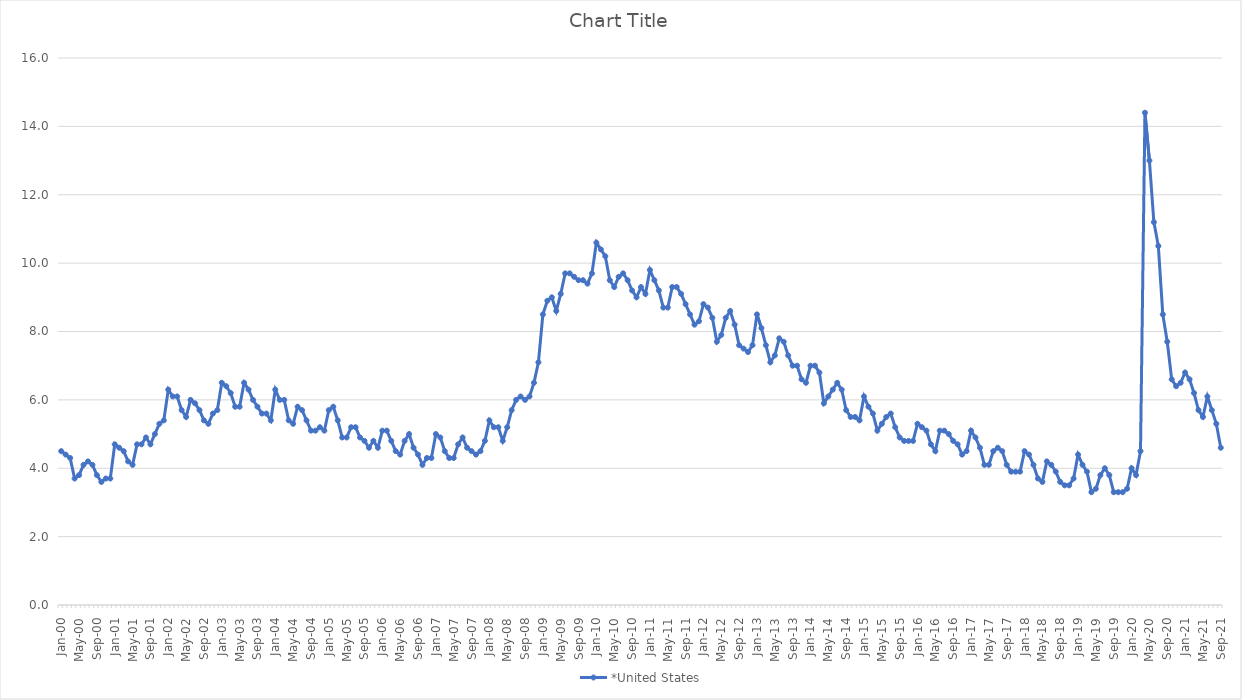
| Category | *United States | Alaska | Alabama | Arkansas | Arizona | California | Colorado | Connecticut | Delaware | Florida | Georgia | Hawaii | Iowa | Idaho | Illinois | Indiana | Kansas | Kentucky | Louisiana | Massachusetts | Maryland | Maine | Michigan | Minnesota | Missouri | Mississippi | Montana | North Carolina | North Dakota | Nebraska | New Hampshire | New Jersey | New Mexico | Nevada | New York | Ohio | Oklahoma | Oregon | Pennsylvania | Rhode Island | South Carolina | South Dakota | Tennessee | Texas | Utah | Virginia | Vermont | Washington | Wisconsin | West Virginia | Wyoming |
|---|---|---|---|---|---|---|---|---|---|---|---|---|---|---|---|---|---|---|---|---|---|---|---|---|---|---|---|---|---|---|---|---|---|---|---|---|---|---|---|---|---|---|---|---|---|---|---|---|---|---|---|
| Jan-00 | 4.5 |  |  |  |  |  |  |  |  |  |  |  |  |  |  |  |  |  |  |  |  |  |  |  |  |  |  |  |  |  |  |  |  |  |  |  |  |  |  |  |  |  |  |  |  |  |  |  |  |  |  |
| Feb-00 | 4.4 |  |  |  |  |  |  |  |  |  |  |  |  |  |  |  |  |  |  |  |  |  |  |  |  |  |  |  |  |  |  |  |  |  |  |  |  |  |  |  |  |  |  |  |  |  |  |  |  |  |  |
| Mar-00 | 4.3 |  |  |  |  |  |  |  |  |  |  |  |  |  |  |  |  |  |  |  |  |  |  |  |  |  |  |  |  |  |  |  |  |  |  |  |  |  |  |  |  |  |  |  |  |  |  |  |  |  |  |
| Apr-00 | 3.7 |  |  |  |  |  |  |  |  |  |  |  |  |  |  |  |  |  |  |  |  |  |  |  |  |  |  |  |  |  |  |  |  |  |  |  |  |  |  |  |  |  |  |  |  |  |  |  |  |  |  |
| May-00 | 3.8 |  |  |  |  |  |  |  |  |  |  |  |  |  |  |  |  |  |  |  |  |  |  |  |  |  |  |  |  |  |  |  |  |  |  |  |  |  |  |  |  |  |  |  |  |  |  |  |  |  |  |
| Jun-00 | 4.1 |  |  |  |  |  |  |  |  |  |  |  |  |  |  |  |  |  |  |  |  |  |  |  |  |  |  |  |  |  |  |  |  |  |  |  |  |  |  |  |  |  |  |  |  |  |  |  |  |  |  |
| Jul-00 | 4.2 |  |  |  |  |  |  |  |  |  |  |  |  |  |  |  |  |  |  |  |  |  |  |  |  |  |  |  |  |  |  |  |  |  |  |  |  |  |  |  |  |  |  |  |  |  |  |  |  |  |  |
| Aug-00 | 4.1 |  |  |  |  |  |  |  |  |  |  |  |  |  |  |  |  |  |  |  |  |  |  |  |  |  |  |  |  |  |  |  |  |  |  |  |  |  |  |  |  |  |  |  |  |  |  |  |  |  |  |
| Sep-00 | 3.8 |  |  |  |  |  |  |  |  |  |  |  |  |  |  |  |  |  |  |  |  |  |  |  |  |  |  |  |  |  |  |  |  |  |  |  |  |  |  |  |  |  |  |  |  |  |  |  |  |  |  |
| Oct-00 | 3.6 |  |  |  |  |  |  |  |  |  |  |  |  |  |  |  |  |  |  |  |  |  |  |  |  |  |  |  |  |  |  |  |  |  |  |  |  |  |  |  |  |  |  |  |  |  |  |  |  |  |  |
| Nov-00 | 3.7 |  |  |  |  |  |  |  |  |  |  |  |  |  |  |  |  |  |  |  |  |  |  |  |  |  |  |  |  |  |  |  |  |  |  |  |  |  |  |  |  |  |  |  |  |  |  |  |  |  |  |
| Dec-00 | 3.7 |  |  |  |  |  |  |  |  |  |  |  |  |  |  |  |  |  |  |  |  |  |  |  |  |  |  |  |  |  |  |  |  |  |  |  |  |  |  |  |  |  |  |  |  |  |  |  |  |  |  |
| Jan-01 | 4.7 |  |  |  |  |  |  |  |  |  |  |  |  |  |  |  |  |  |  |  |  |  |  |  |  |  |  |  |  |  |  |  |  |  |  |  |  |  |  |  |  |  |  |  |  |  |  |  |  |  |  |
| Feb-01 | 4.6 |  |  |  |  |  |  |  |  |  |  |  |  |  |  |  |  |  |  |  |  |  |  |  |  |  |  |  |  |  |  |  |  |  |  |  |  |  |  |  |  |  |  |  |  |  |  |  |  |  |  |
| Mar-01 | 4.5 |  |  |  |  |  |  |  |  |  |  |  |  |  |  |  |  |  |  |  |  |  |  |  |  |  |  |  |  |  |  |  |  |  |  |  |  |  |  |  |  |  |  |  |  |  |  |  |  |  |  |
| Apr-01 | 4.2 |  |  |  |  |  |  |  |  |  |  |  |  |  |  |  |  |  |  |  |  |  |  |  |  |  |  |  |  |  |  |  |  |  |  |  |  |  |  |  |  |  |  |  |  |  |  |  |  |  |  |
| May-01 | 4.1 |  |  |  |  |  |  |  |  |  |  |  |  |  |  |  |  |  |  |  |  |  |  |  |  |  |  |  |  |  |  |  |  |  |  |  |  |  |  |  |  |  |  |  |  |  |  |  |  |  |  |
| Jun-01 | 4.7 |  |  |  |  |  |  |  |  |  |  |  |  |  |  |  |  |  |  |  |  |  |  |  |  |  |  |  |  |  |  |  |  |  |  |  |  |  |  |  |  |  |  |  |  |  |  |  |  |  |  |
| Jul-01 | 4.7 |  |  |  |  |  |  |  |  |  |  |  |  |  |  |  |  |  |  |  |  |  |  |  |  |  |  |  |  |  |  |  |  |  |  |  |  |  |  |  |  |  |  |  |  |  |  |  |  |  |  |
| Aug-01 | 4.9 |  |  |  |  |  |  |  |  |  |  |  |  |  |  |  |  |  |  |  |  |  |  |  |  |  |  |  |  |  |  |  |  |  |  |  |  |  |  |  |  |  |  |  |  |  |  |  |  |  |  |
| Sep-01 | 4.7 |  |  |  |  |  |  |  |  |  |  |  |  |  |  |  |  |  |  |  |  |  |  |  |  |  |  |  |  |  |  |  |  |  |  |  |  |  |  |  |  |  |  |  |  |  |  |  |  |  |  |
| Oct-01 | 5 |  |  |  |  |  |  |  |  |  |  |  |  |  |  |  |  |  |  |  |  |  |  |  |  |  |  |  |  |  |  |  |  |  |  |  |  |  |  |  |  |  |  |  |  |  |  |  |  |  |  |
| Nov-01 | 5.3 |  |  |  |  |  |  |  |  |  |  |  |  |  |  |  |  |  |  |  |  |  |  |  |  |  |  |  |  |  |  |  |  |  |  |  |  |  |  |  |  |  |  |  |  |  |  |  |  |  |  |
| Dec-01 | 5.4 |  |  |  |  |  |  |  |  |  |  |  |  |  |  |  |  |  |  |  |  |  |  |  |  |  |  |  |  |  |  |  |  |  |  |  |  |  |  |  |  |  |  |  |  |  |  |  |  |  |  |
| Jan-02 | 6.3 |  |  |  |  |  |  |  |  |  |  |  |  |  |  |  |  |  |  |  |  |  |  |  |  |  |  |  |  |  |  |  |  |  |  |  |  |  |  |  |  |  |  |  |  |  |  |  |  |  |  |
| Feb-02 | 6.1 |  |  |  |  |  |  |  |  |  |  |  |  |  |  |  |  |  |  |  |  |  |  |  |  |  |  |  |  |  |  |  |  |  |  |  |  |  |  |  |  |  |  |  |  |  |  |  |  |  |  |
| Mar-02 | 6.1 |  |  |  |  |  |  |  |  |  |  |  |  |  |  |  |  |  |  |  |  |  |  |  |  |  |  |  |  |  |  |  |  |  |  |  |  |  |  |  |  |  |  |  |  |  |  |  |  |  |  |
| Apr-02 | 5.7 |  |  |  |  |  |  |  |  |  |  |  |  |  |  |  |  |  |  |  |  |  |  |  |  |  |  |  |  |  |  |  |  |  |  |  |  |  |  |  |  |  |  |  |  |  |  |  |  |  |  |
| May-02 | 5.5 |  |  |  |  |  |  |  |  |  |  |  |  |  |  |  |  |  |  |  |  |  |  |  |  |  |  |  |  |  |  |  |  |  |  |  |  |  |  |  |  |  |  |  |  |  |  |  |  |  |  |
| Jun-02 | 6 |  |  |  |  |  |  |  |  |  |  |  |  |  |  |  |  |  |  |  |  |  |  |  |  |  |  |  |  |  |  |  |  |  |  |  |  |  |  |  |  |  |  |  |  |  |  |  |  |  |  |
| Jul-02 | 5.9 |  |  |  |  |  |  |  |  |  |  |  |  |  |  |  |  |  |  |  |  |  |  |  |  |  |  |  |  |  |  |  |  |  |  |  |  |  |  |  |  |  |  |  |  |  |  |  |  |  |  |
| Aug-02 | 5.7 |  |  |  |  |  |  |  |  |  |  |  |  |  |  |  |  |  |  |  |  |  |  |  |  |  |  |  |  |  |  |  |  |  |  |  |  |  |  |  |  |  |  |  |  |  |  |  |  |  |  |
| Sep-02 | 5.4 |  |  |  |  |  |  |  |  |  |  |  |  |  |  |  |  |  |  |  |  |  |  |  |  |  |  |  |  |  |  |  |  |  |  |  |  |  |  |  |  |  |  |  |  |  |  |  |  |  |  |
| Oct-02 | 5.3 |  |  |  |  |  |  |  |  |  |  |  |  |  |  |  |  |  |  |  |  |  |  |  |  |  |  |  |  |  |  |  |  |  |  |  |  |  |  |  |  |  |  |  |  |  |  |  |  |  |  |
| Nov-02 | 5.6 |  |  |  |  |  |  |  |  |  |  |  |  |  |  |  |  |  |  |  |  |  |  |  |  |  |  |  |  |  |  |  |  |  |  |  |  |  |  |  |  |  |  |  |  |  |  |  |  |  |  |
| Dec-02 | 5.7 |  |  |  |  |  |  |  |  |  |  |  |  |  |  |  |  |  |  |  |  |  |  |  |  |  |  |  |  |  |  |  |  |  |  |  |  |  |  |  |  |  |  |  |  |  |  |  |  |  |  |
| Jan-03 | 6.5 |  |  |  |  |  |  |  |  |  |  |  |  |  |  |  |  |  |  |  |  |  |  |  |  |  |  |  |  |  |  |  |  |  |  |  |  |  |  |  |  |  |  |  |  |  |  |  |  |  |  |
| Feb-03 | 6.4 |  |  |  |  |  |  |  |  |  |  |  |  |  |  |  |  |  |  |  |  |  |  |  |  |  |  |  |  |  |  |  |  |  |  |  |  |  |  |  |  |  |  |  |  |  |  |  |  |  |  |
| Mar-03 | 6.2 |  |  |  |  |  |  |  |  |  |  |  |  |  |  |  |  |  |  |  |  |  |  |  |  |  |  |  |  |  |  |  |  |  |  |  |  |  |  |  |  |  |  |  |  |  |  |  |  |  |  |
| Apr-03 | 5.8 |  |  |  |  |  |  |  |  |  |  |  |  |  |  |  |  |  |  |  |  |  |  |  |  |  |  |  |  |  |  |  |  |  |  |  |  |  |  |  |  |  |  |  |  |  |  |  |  |  |  |
| May-03 | 5.8 |  |  |  |  |  |  |  |  |  |  |  |  |  |  |  |  |  |  |  |  |  |  |  |  |  |  |  |  |  |  |  |  |  |  |  |  |  |  |  |  |  |  |  |  |  |  |  |  |  |  |
| Jun-03 | 6.5 |  |  |  |  |  |  |  |  |  |  |  |  |  |  |  |  |  |  |  |  |  |  |  |  |  |  |  |  |  |  |  |  |  |  |  |  |  |  |  |  |  |  |  |  |  |  |  |  |  |  |
| Jul-03 | 6.3 |  |  |  |  |  |  |  |  |  |  |  |  |  |  |  |  |  |  |  |  |  |  |  |  |  |  |  |  |  |  |  |  |  |  |  |  |  |  |  |  |  |  |  |  |  |  |  |  |  |  |
| Aug-03 | 6 |  |  |  |  |  |  |  |  |  |  |  |  |  |  |  |  |  |  |  |  |  |  |  |  |  |  |  |  |  |  |  |  |  |  |  |  |  |  |  |  |  |  |  |  |  |  |  |  |  |  |
| Sep-03 | 5.8 |  |  |  |  |  |  |  |  |  |  |  |  |  |  |  |  |  |  |  |  |  |  |  |  |  |  |  |  |  |  |  |  |  |  |  |  |  |  |  |  |  |  |  |  |  |  |  |  |  |  |
| Oct-03 | 5.6 |  |  |  |  |  |  |  |  |  |  |  |  |  |  |  |  |  |  |  |  |  |  |  |  |  |  |  |  |  |  |  |  |  |  |  |  |  |  |  |  |  |  |  |  |  |  |  |  |  |  |
| Nov-03 | 5.6 |  |  |  |  |  |  |  |  |  |  |  |  |  |  |  |  |  |  |  |  |  |  |  |  |  |  |  |  |  |  |  |  |  |  |  |  |  |  |  |  |  |  |  |  |  |  |  |  |  |  |
| Dec-03 | 5.4 |  |  |  |  |  |  |  |  |  |  |  |  |  |  |  |  |  |  |  |  |  |  |  |  |  |  |  |  |  |  |  |  |  |  |  |  |  |  |  |  |  |  |  |  |  |  |  |  |  |  |
| Jan-04 | 6.3 |  |  |  |  |  |  |  |  |  |  |  |  |  |  |  |  |  |  |  |  |  |  |  |  |  |  |  |  |  |  |  |  |  |  |  |  |  |  |  |  |  |  |  |  |  |  |  |  |  |  |
| Feb-04 | 6 |  |  |  |  |  |  |  |  |  |  |  |  |  |  |  |  |  |  |  |  |  |  |  |  |  |  |  |  |  |  |  |  |  |  |  |  |  |  |  |  |  |  |  |  |  |  |  |  |  |  |
| Mar-04 | 6 |  |  |  |  |  |  |  |  |  |  |  |  |  |  |  |  |  |  |  |  |  |  |  |  |  |  |  |  |  |  |  |  |  |  |  |  |  |  |  |  |  |  |  |  |  |  |  |  |  |  |
| Apr-04 | 5.4 |  |  |  |  |  |  |  |  |  |  |  |  |  |  |  |  |  |  |  |  |  |  |  |  |  |  |  |  |  |  |  |  |  |  |  |  |  |  |  |  |  |  |  |  |  |  |  |  |  |  |
| May-04 | 5.3 |  |  |  |  |  |  |  |  |  |  |  |  |  |  |  |  |  |  |  |  |  |  |  |  |  |  |  |  |  |  |  |  |  |  |  |  |  |  |  |  |  |  |  |  |  |  |  |  |  |  |
| Jun-04 | 5.8 |  |  |  |  |  |  |  |  |  |  |  |  |  |  |  |  |  |  |  |  |  |  |  |  |  |  |  |  |  |  |  |  |  |  |  |  |  |  |  |  |  |  |  |  |  |  |  |  |  |  |
| Jul-04 | 5.7 |  |  |  |  |  |  |  |  |  |  |  |  |  |  |  |  |  |  |  |  |  |  |  |  |  |  |  |  |  |  |  |  |  |  |  |  |  |  |  |  |  |  |  |  |  |  |  |  |  |  |
| Aug-04 | 5.4 |  |  |  |  |  |  |  |  |  |  |  |  |  |  |  |  |  |  |  |  |  |  |  |  |  |  |  |  |  |  |  |  |  |  |  |  |  |  |  |  |  |  |  |  |  |  |  |  |  |  |
| Sep-04 | 5.1 |  |  |  |  |  |  |  |  |  |  |  |  |  |  |  |  |  |  |  |  |  |  |  |  |  |  |  |  |  |  |  |  |  |  |  |  |  |  |  |  |  |  |  |  |  |  |  |  |  |  |
| Oct-04 | 5.1 |  |  |  |  |  |  |  |  |  |  |  |  |  |  |  |  |  |  |  |  |  |  |  |  |  |  |  |  |  |  |  |  |  |  |  |  |  |  |  |  |  |  |  |  |  |  |  |  |  |  |
| Nov-04 | 5.2 |  |  |  |  |  |  |  |  |  |  |  |  |  |  |  |  |  |  |  |  |  |  |  |  |  |  |  |  |  |  |  |  |  |  |  |  |  |  |  |  |  |  |  |  |  |  |  |  |  |  |
| Dec-04 | 5.1 |  |  |  |  |  |  |  |  |  |  |  |  |  |  |  |  |  |  |  |  |  |  |  |  |  |  |  |  |  |  |  |  |  |  |  |  |  |  |  |  |  |  |  |  |  |  |  |  |  |  |
| Jan-05 | 5.7 |  |  |  |  |  |  |  |  |  |  |  |  |  |  |  |  |  |  |  |  |  |  |  |  |  |  |  |  |  |  |  |  |  |  |  |  |  |  |  |  |  |  |  |  |  |  |  |  |  |  |
| Feb-05 | 5.8 |  |  |  |  |  |  |  |  |  |  |  |  |  |  |  |  |  |  |  |  |  |  |  |  |  |  |  |  |  |  |  |  |  |  |  |  |  |  |  |  |  |  |  |  |  |  |  |  |  |  |
| Mar-05 | 5.4 |  |  |  |  |  |  |  |  |  |  |  |  |  |  |  |  |  |  |  |  |  |  |  |  |  |  |  |  |  |  |  |  |  |  |  |  |  |  |  |  |  |  |  |  |  |  |  |  |  |  |
| Apr-05 | 4.9 |  |  |  |  |  |  |  |  |  |  |  |  |  |  |  |  |  |  |  |  |  |  |  |  |  |  |  |  |  |  |  |  |  |  |  |  |  |  |  |  |  |  |  |  |  |  |  |  |  |  |
| May-05 | 4.9 |  |  |  |  |  |  |  |  |  |  |  |  |  |  |  |  |  |  |  |  |  |  |  |  |  |  |  |  |  |  |  |  |  |  |  |  |  |  |  |  |  |  |  |  |  |  |  |  |  |  |
| Jun-05 | 5.2 |  |  |  |  |  |  |  |  |  |  |  |  |  |  |  |  |  |  |  |  |  |  |  |  |  |  |  |  |  |  |  |  |  |  |  |  |  |  |  |  |  |  |  |  |  |  |  |  |  |  |
| Jul-05 | 5.2 |  |  |  |  |  |  |  |  |  |  |  |  |  |  |  |  |  |  |  |  |  |  |  |  |  |  |  |  |  |  |  |  |  |  |  |  |  |  |  |  |  |  |  |  |  |  |  |  |  |  |
| Aug-05 | 4.9 |  |  |  |  |  |  |  |  |  |  |  |  |  |  |  |  |  |  |  |  |  |  |  |  |  |  |  |  |  |  |  |  |  |  |  |  |  |  |  |  |  |  |  |  |  |  |  |  |  |  |
| Sep-05 | 4.8 |  |  |  |  |  |  |  |  |  |  |  |  |  |  |  |  |  |  |  |  |  |  |  |  |  |  |  |  |  |  |  |  |  |  |  |  |  |  |  |  |  |  |  |  |  |  |  |  |  |  |
| Oct-05 | 4.6 |  |  |  |  |  |  |  |  |  |  |  |  |  |  |  |  |  |  |  |  |  |  |  |  |  |  |  |  |  |  |  |  |  |  |  |  |  |  |  |  |  |  |  |  |  |  |  |  |  |  |
| Nov-05 | 4.8 |  |  |  |  |  |  |  |  |  |  |  |  |  |  |  |  |  |  |  |  |  |  |  |  |  |  |  |  |  |  |  |  |  |  |  |  |  |  |  |  |  |  |  |  |  |  |  |  |  |  |
| Dec-05 | 4.6 |  |  |  |  |  |  |  |  |  |  |  |  |  |  |  |  |  |  |  |  |  |  |  |  |  |  |  |  |  |  |  |  |  |  |  |  |  |  |  |  |  |  |  |  |  |  |  |  |  |  |
| Jan-06 | 5.1 |  |  |  |  |  |  |  |  |  |  |  |  |  |  |  |  |  |  |  |  |  |  |  |  |  |  |  |  |  |  |  |  |  |  |  |  |  |  |  |  |  |  |  |  |  |  |  |  |  |  |
| Feb-06 | 5.1 |  |  |  |  |  |  |  |  |  |  |  |  |  |  |  |  |  |  |  |  |  |  |  |  |  |  |  |  |  |  |  |  |  |  |  |  |  |  |  |  |  |  |  |  |  |  |  |  |  |  |
| Mar-06 | 4.8 |  |  |  |  |  |  |  |  |  |  |  |  |  |  |  |  |  |  |  |  |  |  |  |  |  |  |  |  |  |  |  |  |  |  |  |  |  |  |  |  |  |  |  |  |  |  |  |  |  |  |
| Apr-06 | 4.5 |  |  |  |  |  |  |  |  |  |  |  |  |  |  |  |  |  |  |  |  |  |  |  |  |  |  |  |  |  |  |  |  |  |  |  |  |  |  |  |  |  |  |  |  |  |  |  |  |  |  |
| May-06 | 4.4 |  |  |  |  |  |  |  |  |  |  |  |  |  |  |  |  |  |  |  |  |  |  |  |  |  |  |  |  |  |  |  |  |  |  |  |  |  |  |  |  |  |  |  |  |  |  |  |  |  |  |
| Jun-06 | 4.8 |  |  |  |  |  |  |  |  |  |  |  |  |  |  |  |  |  |  |  |  |  |  |  |  |  |  |  |  |  |  |  |  |  |  |  |  |  |  |  |  |  |  |  |  |  |  |  |  |  |  |
| Jul-06 | 5 |  |  |  |  |  |  |  |  |  |  |  |  |  |  |  |  |  |  |  |  |  |  |  |  |  |  |  |  |  |  |  |  |  |  |  |  |  |  |  |  |  |  |  |  |  |  |  |  |  |  |
| Aug-06 | 4.6 |  |  |  |  |  |  |  |  |  |  |  |  |  |  |  |  |  |  |  |  |  |  |  |  |  |  |  |  |  |  |  |  |  |  |  |  |  |  |  |  |  |  |  |  |  |  |  |  |  |  |
| Sep-06 | 4.4 |  |  |  |  |  |  |  |  |  |  |  |  |  |  |  |  |  |  |  |  |  |  |  |  |  |  |  |  |  |  |  |  |  |  |  |  |  |  |  |  |  |  |  |  |  |  |  |  |  |  |
| Oct-06 | 4.1 |  |  |  |  |  |  |  |  |  |  |  |  |  |  |  |  |  |  |  |  |  |  |  |  |  |  |  |  |  |  |  |  |  |  |  |  |  |  |  |  |  |  |  |  |  |  |  |  |  |  |
| Nov-06 | 4.3 |  |  |  |  |  |  |  |  |  |  |  |  |  |  |  |  |  |  |  |  |  |  |  |  |  |  |  |  |  |  |  |  |  |  |  |  |  |  |  |  |  |  |  |  |  |  |  |  |  |  |
| Dec-06 | 4.3 |  |  |  |  |  |  |  |  |  |  |  |  |  |  |  |  |  |  |  |  |  |  |  |  |  |  |  |  |  |  |  |  |  |  |  |  |  |  |  |  |  |  |  |  |  |  |  |  |  |  |
| Jan-07 | 5 |  |  |  |  |  |  |  |  |  |  |  |  |  |  |  |  |  |  |  |  |  |  |  |  |  |  |  |  |  |  |  |  |  |  |  |  |  |  |  |  |  |  |  |  |  |  |  |  |  |  |
| Feb-07 | 4.9 |  |  |  |  |  |  |  |  |  |  |  |  |  |  |  |  |  |  |  |  |  |  |  |  |  |  |  |  |  |  |  |  |  |  |  |  |  |  |  |  |  |  |  |  |  |  |  |  |  |  |
| Mar-07 | 4.5 |  |  |  |  |  |  |  |  |  |  |  |  |  |  |  |  |  |  |  |  |  |  |  |  |  |  |  |  |  |  |  |  |  |  |  |  |  |  |  |  |  |  |  |  |  |  |  |  |  |  |
| Apr-07 | 4.3 |  |  |  |  |  |  |  |  |  |  |  |  |  |  |  |  |  |  |  |  |  |  |  |  |  |  |  |  |  |  |  |  |  |  |  |  |  |  |  |  |  |  |  |  |  |  |  |  |  |  |
| May-07 | 4.3 |  |  |  |  |  |  |  |  |  |  |  |  |  |  |  |  |  |  |  |  |  |  |  |  |  |  |  |  |  |  |  |  |  |  |  |  |  |  |  |  |  |  |  |  |  |  |  |  |  |  |
| Jun-07 | 4.7 |  |  |  |  |  |  |  |  |  |  |  |  |  |  |  |  |  |  |  |  |  |  |  |  |  |  |  |  |  |  |  |  |  |  |  |  |  |  |  |  |  |  |  |  |  |  |  |  |  |  |
| Jul-07 | 4.9 |  |  |  |  |  |  |  |  |  |  |  |  |  |  |  |  |  |  |  |  |  |  |  |  |  |  |  |  |  |  |  |  |  |  |  |  |  |  |  |  |  |  |  |  |  |  |  |  |  |  |
| Aug-07 | 4.6 |  |  |  |  |  |  |  |  |  |  |  |  |  |  |  |  |  |  |  |  |  |  |  |  |  |  |  |  |  |  |  |  |  |  |  |  |  |  |  |  |  |  |  |  |  |  |  |  |  |  |
| Sep-07 | 4.5 |  |  |  |  |  |  |  |  |  |  |  |  |  |  |  |  |  |  |  |  |  |  |  |  |  |  |  |  |  |  |  |  |  |  |  |  |  |  |  |  |  |  |  |  |  |  |  |  |  |  |
| Oct-07 | 4.4 |  |  |  |  |  |  |  |  |  |  |  |  |  |  |  |  |  |  |  |  |  |  |  |  |  |  |  |  |  |  |  |  |  |  |  |  |  |  |  |  |  |  |  |  |  |  |  |  |  |  |
| Nov-07 | 4.5 |  |  |  |  |  |  |  |  |  |  |  |  |  |  |  |  |  |  |  |  |  |  |  |  |  |  |  |  |  |  |  |  |  |  |  |  |  |  |  |  |  |  |  |  |  |  |  |  |  |  |
| Dec-07 | 4.8 |  |  |  |  |  |  |  |  |  |  |  |  |  |  |  |  |  |  |  |  |  |  |  |  |  |  |  |  |  |  |  |  |  |  |  |  |  |  |  |  |  |  |  |  |  |  |  |  |  |  |
| Jan-08 | 5.4 |  |  |  |  |  |  |  |  |  |  |  |  |  |  |  |  |  |  |  |  |  |  |  |  |  |  |  |  |  |  |  |  |  |  |  |  |  |  |  |  |  |  |  |  |  |  |  |  |  |  |
| Feb-08 | 5.2 |  |  |  |  |  |  |  |  |  |  |  |  |  |  |  |  |  |  |  |  |  |  |  |  |  |  |  |  |  |  |  |  |  |  |  |  |  |  |  |  |  |  |  |  |  |  |  |  |  |  |
| Mar-08 | 5.2 |  |  |  |  |  |  |  |  |  |  |  |  |  |  |  |  |  |  |  |  |  |  |  |  |  |  |  |  |  |  |  |  |  |  |  |  |  |  |  |  |  |  |  |  |  |  |  |  |  |  |
| Apr-08 | 4.8 |  |  |  |  |  |  |  |  |  |  |  |  |  |  |  |  |  |  |  |  |  |  |  |  |  |  |  |  |  |  |  |  |  |  |  |  |  |  |  |  |  |  |  |  |  |  |  |  |  |  |
| May-08 | 5.2 |  |  |  |  |  |  |  |  |  |  |  |  |  |  |  |  |  |  |  |  |  |  |  |  |  |  |  |  |  |  |  |  |  |  |  |  |  |  |  |  |  |  |  |  |  |  |  |  |  |  |
| Jun-08 | 5.7 |  |  |  |  |  |  |  |  |  |  |  |  |  |  |  |  |  |  |  |  |  |  |  |  |  |  |  |  |  |  |  |  |  |  |  |  |  |  |  |  |  |  |  |  |  |  |  |  |  |  |
| Jul-08 | 6 |  |  |  |  |  |  |  |  |  |  |  |  |  |  |  |  |  |  |  |  |  |  |  |  |  |  |  |  |  |  |  |  |  |  |  |  |  |  |  |  |  |  |  |  |  |  |  |  |  |  |
| Aug-08 | 6.1 |  |  |  |  |  |  |  |  |  |  |  |  |  |  |  |  |  |  |  |  |  |  |  |  |  |  |  |  |  |  |  |  |  |  |  |  |  |  |  |  |  |  |  |  |  |  |  |  |  |  |
| Sep-08 | 6 |  |  |  |  |  |  |  |  |  |  |  |  |  |  |  |  |  |  |  |  |  |  |  |  |  |  |  |  |  |  |  |  |  |  |  |  |  |  |  |  |  |  |  |  |  |  |  |  |  |  |
| Oct-08 | 6.1 |  |  |  |  |  |  |  |  |  |  |  |  |  |  |  |  |  |  |  |  |  |  |  |  |  |  |  |  |  |  |  |  |  |  |  |  |  |  |  |  |  |  |  |  |  |  |  |  |  |  |
| Nov-08 | 6.5 |  |  |  |  |  |  |  |  |  |  |  |  |  |  |  |  |  |  |  |  |  |  |  |  |  |  |  |  |  |  |  |  |  |  |  |  |  |  |  |  |  |  |  |  |  |  |  |  |  |  |
| Dec-08 | 7.1 |  |  |  |  |  |  |  |  |  |  |  |  |  |  |  |  |  |  |  |  |  |  |  |  |  |  |  |  |  |  |  |  |  |  |  |  |  |  |  |  |  |  |  |  |  |  |  |  |  |  |
| Jan-09 | 8.5 |  |  |  |  |  |  |  |  |  |  |  |  |  |  |  |  |  |  |  |  |  |  |  |  |  |  |  |  |  |  |  |  |  |  |  |  |  |  |  |  |  |  |  |  |  |  |  |  |  |  |
| Feb-09 | 8.9 |  |  |  |  |  |  |  |  |  |  |  |  |  |  |  |  |  |  |  |  |  |  |  |  |  |  |  |  |  |  |  |  |  |  |  |  |  |  |  |  |  |  |  |  |  |  |  |  |  |  |
| Mar-09 | 9 |  |  |  |  |  |  |  |  |  |  |  |  |  |  |  |  |  |  |  |  |  |  |  |  |  |  |  |  |  |  |  |  |  |  |  |  |  |  |  |  |  |  |  |  |  |  |  |  |  |  |
| Apr-09 | 8.6 |  |  |  |  |  |  |  |  |  |  |  |  |  |  |  |  |  |  |  |  |  |  |  |  |  |  |  |  |  |  |  |  |  |  |  |  |  |  |  |  |  |  |  |  |  |  |  |  |  |  |
| May-09 | 9.1 |  |  |  |  |  |  |  |  |  |  |  |  |  |  |  |  |  |  |  |  |  |  |  |  |  |  |  |  |  |  |  |  |  |  |  |  |  |  |  |  |  |  |  |  |  |  |  |  |  |  |
| Jun-09 | 9.7 |  |  |  |  |  |  |  |  |  |  |  |  |  |  |  |  |  |  |  |  |  |  |  |  |  |  |  |  |  |  |  |  |  |  |  |  |  |  |  |  |  |  |  |  |  |  |  |  |  |  |
| Jul-09 | 9.7 |  |  |  |  |  |  |  |  |  |  |  |  |  |  |  |  |  |  |  |  |  |  |  |  |  |  |  |  |  |  |  |  |  |  |  |  |  |  |  |  |  |  |  |  |  |  |  |  |  |  |
| Aug-09 | 9.6 |  |  |  |  |  |  |  |  |  |  |  |  |  |  |  |  |  |  |  |  |  |  |  |  |  |  |  |  |  |  |  |  |  |  |  |  |  |  |  |  |  |  |  |  |  |  |  |  |  |  |
| Sep-09 | 9.5 |  |  |  |  |  |  |  |  |  |  |  |  |  |  |  |  |  |  |  |  |  |  |  |  |  |  |  |  |  |  |  |  |  |  |  |  |  |  |  |  |  |  |  |  |  |  |  |  |  |  |
| Oct-09 | 9.5 |  |  |  |  |  |  |  |  |  |  |  |  |  |  |  |  |  |  |  |  |  |  |  |  |  |  |  |  |  |  |  |  |  |  |  |  |  |  |  |  |  |  |  |  |  |  |  |  |  |  |
| Nov-09 | 9.4 |  |  |  |  |  |  |  |  |  |  |  |  |  |  |  |  |  |  |  |  |  |  |  |  |  |  |  |  |  |  |  |  |  |  |  |  |  |  |  |  |  |  |  |  |  |  |  |  |  |  |
| Dec-09 | 9.7 |  |  |  |  |  |  |  |  |  |  |  |  |  |  |  |  |  |  |  |  |  |  |  |  |  |  |  |  |  |  |  |  |  |  |  |  |  |  |  |  |  |  |  |  |  |  |  |  |  |  |
| Jan-10 | 10.6 |  |  |  |  |  |  |  |  |  |  |  |  |  |  |  |  |  |  |  |  |  |  |  |  |  |  |  |  |  |  |  |  |  |  |  |  |  |  |  |  |  |  |  |  |  |  |  |  |  |  |
| Feb-10 | 10.4 |  |  |  |  |  |  |  |  |  |  |  |  |  |  |  |  |  |  |  |  |  |  |  |  |  |  |  |  |  |  |  |  |  |  |  |  |  |  |  |  |  |  |  |  |  |  |  |  |  |  |
| Mar-10 | 10.2 |  |  |  |  |  |  |  |  |  |  |  |  |  |  |  |  |  |  |  |  |  |  |  |  |  |  |  |  |  |  |  |  |  |  |  |  |  |  |  |  |  |  |  |  |  |  |  |  |  |  |
| Apr-10 | 9.5 |  |  |  |  |  |  |  |  |  |  |  |  |  |  |  |  |  |  |  |  |  |  |  |  |  |  |  |  |  |  |  |  |  |  |  |  |  |  |  |  |  |  |  |  |  |  |  |  |  |  |
| May-10 | 9.3 |  |  |  |  |  |  |  |  |  |  |  |  |  |  |  |  |  |  |  |  |  |  |  |  |  |  |  |  |  |  |  |  |  |  |  |  |  |  |  |  |  |  |  |  |  |  |  |  |  |  |
| Jun-10 | 9.6 |  |  |  |  |  |  |  |  |  |  |  |  |  |  |  |  |  |  |  |  |  |  |  |  |  |  |  |  |  |  |  |  |  |  |  |  |  |  |  |  |  |  |  |  |  |  |  |  |  |  |
| Jul-10 | 9.7 |  |  |  |  |  |  |  |  |  |  |  |  |  |  |  |  |  |  |  |  |  |  |  |  |  |  |  |  |  |  |  |  |  |  |  |  |  |  |  |  |  |  |  |  |  |  |  |  |  |  |
| Aug-10 | 9.5 |  |  |  |  |  |  |  |  |  |  |  |  |  |  |  |  |  |  |  |  |  |  |  |  |  |  |  |  |  |  |  |  |  |  |  |  |  |  |  |  |  |  |  |  |  |  |  |  |  |  |
| Sep-10 | 9.2 |  |  |  |  |  |  |  |  |  |  |  |  |  |  |  |  |  |  |  |  |  |  |  |  |  |  |  |  |  |  |  |  |  |  |  |  |  |  |  |  |  |  |  |  |  |  |  |  |  |  |
| Oct-10 | 9 |  |  |  |  |  |  |  |  |  |  |  |  |  |  |  |  |  |  |  |  |  |  |  |  |  |  |  |  |  |  |  |  |  |  |  |  |  |  |  |  |  |  |  |  |  |  |  |  |  |  |
| Nov-10 | 9.3 |  |  |  |  |  |  |  |  |  |  |  |  |  |  |  |  |  |  |  |  |  |  |  |  |  |  |  |  |  |  |  |  |  |  |  |  |  |  |  |  |  |  |  |  |  |  |  |  |  |  |
| Dec-10 | 9.1 |  |  |  |  |  |  |  |  |  |  |  |  |  |  |  |  |  |  |  |  |  |  |  |  |  |  |  |  |  |  |  |  |  |  |  |  |  |  |  |  |  |  |  |  |  |  |  |  |  |  |
| Jan-11 | 9.8 |  |  |  |  |  |  |  |  |  |  |  |  |  |  |  |  |  |  |  |  |  |  |  |  |  |  |  |  |  |  |  |  |  |  |  |  |  |  |  |  |  |  |  |  |  |  |  |  |  |  |
| Feb-11 | 9.5 |  |  |  |  |  |  |  |  |  |  |  |  |  |  |  |  |  |  |  |  |  |  |  |  |  |  |  |  |  |  |  |  |  |  |  |  |  |  |  |  |  |  |  |  |  |  |  |  |  |  |
| Mar-11 | 9.2 |  |  |  |  |  |  |  |  |  |  |  |  |  |  |  |  |  |  |  |  |  |  |  |  |  |  |  |  |  |  |  |  |  |  |  |  |  |  |  |  |  |  |  |  |  |  |  |  |  |  |
| Apr-11 | 8.7 |  |  |  |  |  |  |  |  |  |  |  |  |  |  |  |  |  |  |  |  |  |  |  |  |  |  |  |  |  |  |  |  |  |  |  |  |  |  |  |  |  |  |  |  |  |  |  |  |  |  |
| May-11 | 8.7 |  |  |  |  |  |  |  |  |  |  |  |  |  |  |  |  |  |  |  |  |  |  |  |  |  |  |  |  |  |  |  |  |  |  |  |  |  |  |  |  |  |  |  |  |  |  |  |  |  |  |
| Jun-11 | 9.3 |  |  |  |  |  |  |  |  |  |  |  |  |  |  |  |  |  |  |  |  |  |  |  |  |  |  |  |  |  |  |  |  |  |  |  |  |  |  |  |  |  |  |  |  |  |  |  |  |  |  |
| Jul-11 | 9.3 |  |  |  |  |  |  |  |  |  |  |  |  |  |  |  |  |  |  |  |  |  |  |  |  |  |  |  |  |  |  |  |  |  |  |  |  |  |  |  |  |  |  |  |  |  |  |  |  |  |  |
| Aug-11 | 9.1 |  |  |  |  |  |  |  |  |  |  |  |  |  |  |  |  |  |  |  |  |  |  |  |  |  |  |  |  |  |  |  |  |  |  |  |  |  |  |  |  |  |  |  |  |  |  |  |  |  |  |
| Sep-11 | 8.8 |  |  |  |  |  |  |  |  |  |  |  |  |  |  |  |  |  |  |  |  |  |  |  |  |  |  |  |  |  |  |  |  |  |  |  |  |  |  |  |  |  |  |  |  |  |  |  |  |  |  |
| Oct-11 | 8.5 |  |  |  |  |  |  |  |  |  |  |  |  |  |  |  |  |  |  |  |  |  |  |  |  |  |  |  |  |  |  |  |  |  |  |  |  |  |  |  |  |  |  |  |  |  |  |  |  |  |  |
| Nov-11 | 8.2 |  |  |  |  |  |  |  |  |  |  |  |  |  |  |  |  |  |  |  |  |  |  |  |  |  |  |  |  |  |  |  |  |  |  |  |  |  |  |  |  |  |  |  |  |  |  |  |  |  |  |
| Dec-11 | 8.3 |  |  |  |  |  |  |  |  |  |  |  |  |  |  |  |  |  |  |  |  |  |  |  |  |  |  |  |  |  |  |  |  |  |  |  |  |  |  |  |  |  |  |  |  |  |  |  |  |  |  |
| Jan-12 | 8.8 |  |  |  |  |  |  |  |  |  |  |  |  |  |  |  |  |  |  |  |  |  |  |  |  |  |  |  |  |  |  |  |  |  |  |  |  |  |  |  |  |  |  |  |  |  |  |  |  |  |  |
| Feb-12 | 8.7 |  |  |  |  |  |  |  |  |  |  |  |  |  |  |  |  |  |  |  |  |  |  |  |  |  |  |  |  |  |  |  |  |  |  |  |  |  |  |  |  |  |  |  |  |  |  |  |  |  |  |
| Mar-12 | 8.4 |  |  |  |  |  |  |  |  |  |  |  |  |  |  |  |  |  |  |  |  |  |  |  |  |  |  |  |  |  |  |  |  |  |  |  |  |  |  |  |  |  |  |  |  |  |  |  |  |  |  |
| Apr-12 | 7.7 |  |  |  |  |  |  |  |  |  |  |  |  |  |  |  |  |  |  |  |  |  |  |  |  |  |  |  |  |  |  |  |  |  |  |  |  |  |  |  |  |  |  |  |  |  |  |  |  |  |  |
| May-12 | 7.9 |  |  |  |  |  |  |  |  |  |  |  |  |  |  |  |  |  |  |  |  |  |  |  |  |  |  |  |  |  |  |  |  |  |  |  |  |  |  |  |  |  |  |  |  |  |  |  |  |  |  |
| Jun-12 | 8.4 |  |  |  |  |  |  |  |  |  |  |  |  |  |  |  |  |  |  |  |  |  |  |  |  |  |  |  |  |  |  |  |  |  |  |  |  |  |  |  |  |  |  |  |  |  |  |  |  |  |  |
| Jul-12 | 8.6 |  |  |  |  |  |  |  |  |  |  |  |  |  |  |  |  |  |  |  |  |  |  |  |  |  |  |  |  |  |  |  |  |  |  |  |  |  |  |  |  |  |  |  |  |  |  |  |  |  |  |
| Aug-12 | 8.2 |  |  |  |  |  |  |  |  |  |  |  |  |  |  |  |  |  |  |  |  |  |  |  |  |  |  |  |  |  |  |  |  |  |  |  |  |  |  |  |  |  |  |  |  |  |  |  |  |  |  |
| Sep-12 | 7.6 |  |  |  |  |  |  |  |  |  |  |  |  |  |  |  |  |  |  |  |  |  |  |  |  |  |  |  |  |  |  |  |  |  |  |  |  |  |  |  |  |  |  |  |  |  |  |  |  |  |  |
| Oct-12 | 7.5 |  |  |  |  |  |  |  |  |  |  |  |  |  |  |  |  |  |  |  |  |  |  |  |  |  |  |  |  |  |  |  |  |  |  |  |  |  |  |  |  |  |  |  |  |  |  |  |  |  |  |
| Nov-12 | 7.4 |  |  |  |  |  |  |  |  |  |  |  |  |  |  |  |  |  |  |  |  |  |  |  |  |  |  |  |  |  |  |  |  |  |  |  |  |  |  |  |  |  |  |  |  |  |  |  |  |  |  |
| Dec-12 | 7.6 |  |  |  |  |  |  |  |  |  |  |  |  |  |  |  |  |  |  |  |  |  |  |  |  |  |  |  |  |  |  |  |  |  |  |  |  |  |  |  |  |  |  |  |  |  |  |  |  |  |  |
| Jan-13 | 8.5 |  |  |  |  |  |  |  |  |  |  |  |  |  |  |  |  |  |  |  |  |  |  |  |  |  |  |  |  |  |  |  |  |  |  |  |  |  |  |  |  |  |  |  |  |  |  |  |  |  |  |
| Feb-13 | 8.1 |  |  |  |  |  |  |  |  |  |  |  |  |  |  |  |  |  |  |  |  |  |  |  |  |  |  |  |  |  |  |  |  |  |  |  |  |  |  |  |  |  |  |  |  |  |  |  |  |  |  |
| Mar-13 | 7.6 |  |  |  |  |  |  |  |  |  |  |  |  |  |  |  |  |  |  |  |  |  |  |  |  |  |  |  |  |  |  |  |  |  |  |  |  |  |  |  |  |  |  |  |  |  |  |  |  |  |  |
| Apr-13 | 7.1 |  |  |  |  |  |  |  |  |  |  |  |  |  |  |  |  |  |  |  |  |  |  |  |  |  |  |  |  |  |  |  |  |  |  |  |  |  |  |  |  |  |  |  |  |  |  |  |  |  |  |
| May-13 | 7.3 |  |  |  |  |  |  |  |  |  |  |  |  |  |  |  |  |  |  |  |  |  |  |  |  |  |  |  |  |  |  |  |  |  |  |  |  |  |  |  |  |  |  |  |  |  |  |  |  |  |  |
| Jun-13 | 7.8 |  |  |  |  |  |  |  |  |  |  |  |  |  |  |  |  |  |  |  |  |  |  |  |  |  |  |  |  |  |  |  |  |  |  |  |  |  |  |  |  |  |  |  |  |  |  |  |  |  |  |
| Jul-13 | 7.7 |  |  |  |  |  |  |  |  |  |  |  |  |  |  |  |  |  |  |  |  |  |  |  |  |  |  |  |  |  |  |  |  |  |  |  |  |  |  |  |  |  |  |  |  |  |  |  |  |  |  |
| Aug-13 | 7.3 |  |  |  |  |  |  |  |  |  |  |  |  |  |  |  |  |  |  |  |  |  |  |  |  |  |  |  |  |  |  |  |  |  |  |  |  |  |  |  |  |  |  |  |  |  |  |  |  |  |  |
| Sep-13 | 7 |  |  |  |  |  |  |  |  |  |  |  |  |  |  |  |  |  |  |  |  |  |  |  |  |  |  |  |  |  |  |  |  |  |  |  |  |  |  |  |  |  |  |  |  |  |  |  |  |  |  |
| Oct-13 | 7 |  |  |  |  |  |  |  |  |  |  |  |  |  |  |  |  |  |  |  |  |  |  |  |  |  |  |  |  |  |  |  |  |  |  |  |  |  |  |  |  |  |  |  |  |  |  |  |  |  |  |
| Nov-13 | 6.6 |  |  |  |  |  |  |  |  |  |  |  |  |  |  |  |  |  |  |  |  |  |  |  |  |  |  |  |  |  |  |  |  |  |  |  |  |  |  |  |  |  |  |  |  |  |  |  |  |  |  |
| Dec-13 | 6.5 |  |  |  |  |  |  |  |  |  |  |  |  |  |  |  |  |  |  |  |  |  |  |  |  |  |  |  |  |  |  |  |  |  |  |  |  |  |  |  |  |  |  |  |  |  |  |  |  |  |  |
| Jan-14 | 7 |  |  |  |  |  |  |  |  |  |  |  |  |  |  |  |  |  |  |  |  |  |  |  |  |  |  |  |  |  |  |  |  |  |  |  |  |  |  |  |  |  |  |  |  |  |  |  |  |  |  |
| Feb-14 | 7 |  |  |  |  |  |  |  |  |  |  |  |  |  |  |  |  |  |  |  |  |  |  |  |  |  |  |  |  |  |  |  |  |  |  |  |  |  |  |  |  |  |  |  |  |  |  |  |  |  |  |
| Mar-14 | 6.8 |  |  |  |  |  |  |  |  |  |  |  |  |  |  |  |  |  |  |  |  |  |  |  |  |  |  |  |  |  |  |  |  |  |  |  |  |  |  |  |  |  |  |  |  |  |  |  |  |  |  |
| Apr-14 | 5.9 |  |  |  |  |  |  |  |  |  |  |  |  |  |  |  |  |  |  |  |  |  |  |  |  |  |  |  |  |  |  |  |  |  |  |  |  |  |  |  |  |  |  |  |  |  |  |  |  |  |  |
| May-14 | 6.1 |  |  |  |  |  |  |  |  |  |  |  |  |  |  |  |  |  |  |  |  |  |  |  |  |  |  |  |  |  |  |  |  |  |  |  |  |  |  |  |  |  |  |  |  |  |  |  |  |  |  |
| Jun-14 | 6.3 |  |  |  |  |  |  |  |  |  |  |  |  |  |  |  |  |  |  |  |  |  |  |  |  |  |  |  |  |  |  |  |  |  |  |  |  |  |  |  |  |  |  |  |  |  |  |  |  |  |  |
| Jul-14 | 6.5 |  |  |  |  |  |  |  |  |  |  |  |  |  |  |  |  |  |  |  |  |  |  |  |  |  |  |  |  |  |  |  |  |  |  |  |  |  |  |  |  |  |  |  |  |  |  |  |  |  |  |
| Aug-14 | 6.3 |  |  |  |  |  |  |  |  |  |  |  |  |  |  |  |  |  |  |  |  |  |  |  |  |  |  |  |  |  |  |  |  |  |  |  |  |  |  |  |  |  |  |  |  |  |  |  |  |  |  |
| Sep-14 | 5.7 |  |  |  |  |  |  |  |  |  |  |  |  |  |  |  |  |  |  |  |  |  |  |  |  |  |  |  |  |  |  |  |  |  |  |  |  |  |  |  |  |  |  |  |  |  |  |  |  |  |  |
| Oct-14 | 5.5 |  |  |  |  |  |  |  |  |  |  |  |  |  |  |  |  |  |  |  |  |  |  |  |  |  |  |  |  |  |  |  |  |  |  |  |  |  |  |  |  |  |  |  |  |  |  |  |  |  |  |
| Nov-14 | 5.5 |  |  |  |  |  |  |  |  |  |  |  |  |  |  |  |  |  |  |  |  |  |  |  |  |  |  |  |  |  |  |  |  |  |  |  |  |  |  |  |  |  |  |  |  |  |  |  |  |  |  |
| Dec-14 | 5.4 |  |  |  |  |  |  |  |  |  |  |  |  |  |  |  |  |  |  |  |  |  |  |  |  |  |  |  |  |  |  |  |  |  |  |  |  |  |  |  |  |  |  |  |  |  |  |  |  |  |  |
| Jan-15 | 6.1 |  |  |  |  |  |  |  |  |  |  |  |  |  |  |  |  |  |  |  |  |  |  |  |  |  |  |  |  |  |  |  |  |  |  |  |  |  |  |  |  |  |  |  |  |  |  |  |  |  |  |
| Feb-15 | 5.8 |  |  |  |  |  |  |  |  |  |  |  |  |  |  |  |  |  |  |  |  |  |  |  |  |  |  |  |  |  |  |  |  |  |  |  |  |  |  |  |  |  |  |  |  |  |  |  |  |  |  |
| Mar-15 | 5.6 |  |  |  |  |  |  |  |  |  |  |  |  |  |  |  |  |  |  |  |  |  |  |  |  |  |  |  |  |  |  |  |  |  |  |  |  |  |  |  |  |  |  |  |  |  |  |  |  |  |  |
| Apr-15 | 5.1 |  |  |  |  |  |  |  |  |  |  |  |  |  |  |  |  |  |  |  |  |  |  |  |  |  |  |  |  |  |  |  |  |  |  |  |  |  |  |  |  |  |  |  |  |  |  |  |  |  |  |
| May-15 | 5.3 |  |  |  |  |  |  |  |  |  |  |  |  |  |  |  |  |  |  |  |  |  |  |  |  |  |  |  |  |  |  |  |  |  |  |  |  |  |  |  |  |  |  |  |  |  |  |  |  |  |  |
| Jun-15 | 5.5 |  |  |  |  |  |  |  |  |  |  |  |  |  |  |  |  |  |  |  |  |  |  |  |  |  |  |  |  |  |  |  |  |  |  |  |  |  |  |  |  |  |  |  |  |  |  |  |  |  |  |
| Jul-15 | 5.6 |  |  |  |  |  |  |  |  |  |  |  |  |  |  |  |  |  |  |  |  |  |  |  |  |  |  |  |  |  |  |  |  |  |  |  |  |  |  |  |  |  |  |  |  |  |  |  |  |  |  |
| Aug-15 | 5.2 |  |  |  |  |  |  |  |  |  |  |  |  |  |  |  |  |  |  |  |  |  |  |  |  |  |  |  |  |  |  |  |  |  |  |  |  |  |  |  |  |  |  |  |  |  |  |  |  |  |  |
| Sep-15 | 4.9 |  |  |  |  |  |  |  |  |  |  |  |  |  |  |  |  |  |  |  |  |  |  |  |  |  |  |  |  |  |  |  |  |  |  |  |  |  |  |  |  |  |  |  |  |  |  |  |  |  |  |
| Oct-15 | 4.8 |  |  |  |  |  |  |  |  |  |  |  |  |  |  |  |  |  |  |  |  |  |  |  |  |  |  |  |  |  |  |  |  |  |  |  |  |  |  |  |  |  |  |  |  |  |  |  |  |  |  |
| Nov-15 | 4.8 |  |  |  |  |  |  |  |  |  |  |  |  |  |  |  |  |  |  |  |  |  |  |  |  |  |  |  |  |  |  |  |  |  |  |  |  |  |  |  |  |  |  |  |  |  |  |  |  |  |  |
| Dec-15 | 4.8 |  |  |  |  |  |  |  |  |  |  |  |  |  |  |  |  |  |  |  |  |  |  |  |  |  |  |  |  |  |  |  |  |  |  |  |  |  |  |  |  |  |  |  |  |  |  |  |  |  |  |
| Jan-16 | 5.3 |  |  |  |  |  |  |  |  |  |  |  |  |  |  |  |  |  |  |  |  |  |  |  |  |  |  |  |  |  |  |  |  |  |  |  |  |  |  |  |  |  |  |  |  |  |  |  |  |  |  |
| Feb-16 | 5.2 |  |  |  |  |  |  |  |  |  |  |  |  |  |  |  |  |  |  |  |  |  |  |  |  |  |  |  |  |  |  |  |  |  |  |  |  |  |  |  |  |  |  |  |  |  |  |  |  |  |  |
| Mar-16 | 5.1 |  |  |  |  |  |  |  |  |  |  |  |  |  |  |  |  |  |  |  |  |  |  |  |  |  |  |  |  |  |  |  |  |  |  |  |  |  |  |  |  |  |  |  |  |  |  |  |  |  |  |
| Apr-16 | 4.7 |  |  |  |  |  |  |  |  |  |  |  |  |  |  |  |  |  |  |  |  |  |  |  |  |  |  |  |  |  |  |  |  |  |  |  |  |  |  |  |  |  |  |  |  |  |  |  |  |  |  |
| May-16 | 4.5 |  |  |  |  |  |  |  |  |  |  |  |  |  |  |  |  |  |  |  |  |  |  |  |  |  |  |  |  |  |  |  |  |  |  |  |  |  |  |  |  |  |  |  |  |  |  |  |  |  |  |
| Jun-16 | 5.1 |  |  |  |  |  |  |  |  |  |  |  |  |  |  |  |  |  |  |  |  |  |  |  |  |  |  |  |  |  |  |  |  |  |  |  |  |  |  |  |  |  |  |  |  |  |  |  |  |  |  |
| Jul-16 | 5.1 |  |  |  |  |  |  |  |  |  |  |  |  |  |  |  |  |  |  |  |  |  |  |  |  |  |  |  |  |  |  |  |  |  |  |  |  |  |  |  |  |  |  |  |  |  |  |  |  |  |  |
| Aug-16 | 5 |  |  |  |  |  |  |  |  |  |  |  |  |  |  |  |  |  |  |  |  |  |  |  |  |  |  |  |  |  |  |  |  |  |  |  |  |  |  |  |  |  |  |  |  |  |  |  |  |  |  |
| Sep-16 | 4.8 |  |  |  |  |  |  |  |  |  |  |  |  |  |  |  |  |  |  |  |  |  |  |  |  |  |  |  |  |  |  |  |  |  |  |  |  |  |  |  |  |  |  |  |  |  |  |  |  |  |  |
| Oct-16 | 4.7 |  |  |  |  |  |  |  |  |  |  |  |  |  |  |  |  |  |  |  |  |  |  |  |  |  |  |  |  |  |  |  |  |  |  |  |  |  |  |  |  |  |  |  |  |  |  |  |  |  |  |
| Nov-16 | 4.4 |  |  |  |  |  |  |  |  |  |  |  |  |  |  |  |  |  |  |  |  |  |  |  |  |  |  |  |  |  |  |  |  |  |  |  |  |  |  |  |  |  |  |  |  |  |  |  |  |  |  |
| Dec-16 | 4.5 |  |  |  |  |  |  |  |  |  |  |  |  |  |  |  |  |  |  |  |  |  |  |  |  |  |  |  |  |  |  |  |  |  |  |  |  |  |  |  |  |  |  |  |  |  |  |  |  |  |  |
| Jan-17 | 5.1 |  |  |  |  |  |  |  |  |  |  |  |  |  |  |  |  |  |  |  |  |  |  |  |  |  |  |  |  |  |  |  |  |  |  |  |  |  |  |  |  |  |  |  |  |  |  |  |  |  |  |
| Feb-17 | 4.9 |  |  |  |  |  |  |  |  |  |  |  |  |  |  |  |  |  |  |  |  |  |  |  |  |  |  |  |  |  |  |  |  |  |  |  |  |  |  |  |  |  |  |  |  |  |  |  |  |  |  |
| Mar-17 | 4.6 |  |  |  |  |  |  |  |  |  |  |  |  |  |  |  |  |  |  |  |  |  |  |  |  |  |  |  |  |  |  |  |  |  |  |  |  |  |  |  |  |  |  |  |  |  |  |  |  |  |  |
| Apr-17 | 4.1 |  |  |  |  |  |  |  |  |  |  |  |  |  |  |  |  |  |  |  |  |  |  |  |  |  |  |  |  |  |  |  |  |  |  |  |  |  |  |  |  |  |  |  |  |  |  |  |  |  |  |
| May-17 | 4.1 |  |  |  |  |  |  |  |  |  |  |  |  |  |  |  |  |  |  |  |  |  |  |  |  |  |  |  |  |  |  |  |  |  |  |  |  |  |  |  |  |  |  |  |  |  |  |  |  |  |  |
| Jun-17 | 4.5 |  |  |  |  |  |  |  |  |  |  |  |  |  |  |  |  |  |  |  |  |  |  |  |  |  |  |  |  |  |  |  |  |  |  |  |  |  |  |  |  |  |  |  |  |  |  |  |  |  |  |
| Jul-17 | 4.6 |  |  |  |  |  |  |  |  |  |  |  |  |  |  |  |  |  |  |  |  |  |  |  |  |  |  |  |  |  |  |  |  |  |  |  |  |  |  |  |  |  |  |  |  |  |  |  |  |  |  |
| Aug-17 | 4.5 |  |  |  |  |  |  |  |  |  |  |  |  |  |  |  |  |  |  |  |  |  |  |  |  |  |  |  |  |  |  |  |  |  |  |  |  |  |  |  |  |  |  |  |  |  |  |  |  |  |  |
| Sep-17 | 4.1 |  |  |  |  |  |  |  |  |  |  |  |  |  |  |  |  |  |  |  |  |  |  |  |  |  |  |  |  |  |  |  |  |  |  |  |  |  |  |  |  |  |  |  |  |  |  |  |  |  |  |
| Oct-17 | 3.9 |  |  |  |  |  |  |  |  |  |  |  |  |  |  |  |  |  |  |  |  |  |  |  |  |  |  |  |  |  |  |  |  |  |  |  |  |  |  |  |  |  |  |  |  |  |  |  |  |  |  |
| Nov-17 | 3.9 |  |  |  |  |  |  |  |  |  |  |  |  |  |  |  |  |  |  |  |  |  |  |  |  |  |  |  |  |  |  |  |  |  |  |  |  |  |  |  |  |  |  |  |  |  |  |  |  |  |  |
| Dec-17 | 3.9 |  |  |  |  |  |  |  |  |  |  |  |  |  |  |  |  |  |  |  |  |  |  |  |  |  |  |  |  |  |  |  |  |  |  |  |  |  |  |  |  |  |  |  |  |  |  |  |  |  |  |
| Jan-18 | 4.5 |  |  |  |  |  |  |  |  |  |  |  |  |  |  |  |  |  |  |  |  |  |  |  |  |  |  |  |  |  |  |  |  |  |  |  |  |  |  |  |  |  |  |  |  |  |  |  |  |  |  |
| Feb-18 | 4.4 |  |  |  |  |  |  |  |  |  |  |  |  |  |  |  |  |  |  |  |  |  |  |  |  |  |  |  |  |  |  |  |  |  |  |  |  |  |  |  |  |  |  |  |  |  |  |  |  |  |  |
| Mar-18 | 4.1 |  |  |  |  |  |  |  |  |  |  |  |  |  |  |  |  |  |  |  |  |  |  |  |  |  |  |  |  |  |  |  |  |  |  |  |  |  |  |  |  |  |  |  |  |  |  |  |  |  |  |
| Apr-18 | 3.7 |  |  |  |  |  |  |  |  |  |  |  |  |  |  |  |  |  |  |  |  |  |  |  |  |  |  |  |  |  |  |  |  |  |  |  |  |  |  |  |  |  |  |  |  |  |  |  |  |  |  |
| May-18 | 3.6 |  |  |  |  |  |  |  |  |  |  |  |  |  |  |  |  |  |  |  |  |  |  |  |  |  |  |  |  |  |  |  |  |  |  |  |  |  |  |  |  |  |  |  |  |  |  |  |  |  |  |
| Jun-18 | 4.2 |  |  |  |  |  |  |  |  |  |  |  |  |  |  |  |  |  |  |  |  |  |  |  |  |  |  |  |  |  |  |  |  |  |  |  |  |  |  |  |  |  |  |  |  |  |  |  |  |  |  |
| Jul-18 | 4.1 |  |  |  |  |  |  |  |  |  |  |  |  |  |  |  |  |  |  |  |  |  |  |  |  |  |  |  |  |  |  |  |  |  |  |  |  |  |  |  |  |  |  |  |  |  |  |  |  |  |  |
| Aug-18 | 3.9 |  |  |  |  |  |  |  |  |  |  |  |  |  |  |  |  |  |  |  |  |  |  |  |  |  |  |  |  |  |  |  |  |  |  |  |  |  |  |  |  |  |  |  |  |  |  |  |  |  |  |
| Sep-18 | 3.6 |  |  |  |  |  |  |  |  |  |  |  |  |  |  |  |  |  |  |  |  |  |  |  |  |  |  |  |  |  |  |  |  |  |  |  |  |  |  |  |  |  |  |  |  |  |  |  |  |  |  |
| Oct-18 | 3.5 |  |  |  |  |  |  |  |  |  |  |  |  |  |  |  |  |  |  |  |  |  |  |  |  |  |  |  |  |  |  |  |  |  |  |  |  |  |  |  |  |  |  |  |  |  |  |  |  |  |  |
| Nov-18 | 3.5 |  |  |  |  |  |  |  |  |  |  |  |  |  |  |  |  |  |  |  |  |  |  |  |  |  |  |  |  |  |  |  |  |  |  |  |  |  |  |  |  |  |  |  |  |  |  |  |  |  |  |
| Dec-18 | 3.7 |  |  |  |  |  |  |  |  |  |  |  |  |  |  |  |  |  |  |  |  |  |  |  |  |  |  |  |  |  |  |  |  |  |  |  |  |  |  |  |  |  |  |  |  |  |  |  |  |  |  |
| Jan-19 | 4.4 |  |  |  |  |  |  |  |  |  |  |  |  |  |  |  |  |  |  |  |  |  |  |  |  |  |  |  |  |  |  |  |  |  |  |  |  |  |  |  |  |  |  |  |  |  |  |  |  |  |  |
| Feb-19 | 4.1 |  |  |  |  |  |  |  |  |  |  |  |  |  |  |  |  |  |  |  |  |  |  |  |  |  |  |  |  |  |  |  |  |  |  |  |  |  |  |  |  |  |  |  |  |  |  |  |  |  |  |
| Mar-19 | 3.9 |  |  |  |  |  |  |  |  |  |  |  |  |  |  |  |  |  |  |  |  |  |  |  |  |  |  |  |  |  |  |  |  |  |  |  |  |  |  |  |  |  |  |  |  |  |  |  |  |  |  |
| Apr-19 | 3.3 |  |  |  |  |  |  |  |  |  |  |  |  |  |  |  |  |  |  |  |  |  |  |  |  |  |  |  |  |  |  |  |  |  |  |  |  |  |  |  |  |  |  |  |  |  |  |  |  |  |  |
| May-19 | 3.4 |  |  |  |  |  |  |  |  |  |  |  |  |  |  |  |  |  |  |  |  |  |  |  |  |  |  |  |  |  |  |  |  |  |  |  |  |  |  |  |  |  |  |  |  |  |  |  |  |  |  |
| Jun-19 | 3.8 |  |  |  |  |  |  |  |  |  |  |  |  |  |  |  |  |  |  |  |  |  |  |  |  |  |  |  |  |  |  |  |  |  |  |  |  |  |  |  |  |  |  |  |  |  |  |  |  |  |  |
| Jul-19 | 4 |  |  |  |  |  |  |  |  |  |  |  |  |  |  |  |  |  |  |  |  |  |  |  |  |  |  |  |  |  |  |  |  |  |  |  |  |  |  |  |  |  |  |  |  |  |  |  |  |  |  |
| Aug-19 | 3.8 |  |  |  |  |  |  |  |  |  |  |  |  |  |  |  |  |  |  |  |  |  |  |  |  |  |  |  |  |  |  |  |  |  |  |  |  |  |  |  |  |  |  |  |  |  |  |  |  |  |  |
| Sep-19 | 3.3 |  |  |  |  |  |  |  |  |  |  |  |  |  |  |  |  |  |  |  |  |  |  |  |  |  |  |  |  |  |  |  |  |  |  |  |  |  |  |  |  |  |  |  |  |  |  |  |  |  |  |
| Oct-19 | 3.3 |  |  |  |  |  |  |  |  |  |  |  |  |  |  |  |  |  |  |  |  |  |  |  |  |  |  |  |  |  |  |  |  |  |  |  |  |  |  |  |  |  |  |  |  |  |  |  |  |  |  |
| Nov-19 | 3.3 |  |  |  |  |  |  |  |  |  |  |  |  |  |  |  |  |  |  |  |  |  |  |  |  |  |  |  |  |  |  |  |  |  |  |  |  |  |  |  |  |  |  |  |  |  |  |  |  |  |  |
| Dec-19 | 3.4 |  |  |  |  |  |  |  |  |  |  |  |  |  |  |  |  |  |  |  |  |  |  |  |  |  |  |  |  |  |  |  |  |  |  |  |  |  |  |  |  |  |  |  |  |  |  |  |  |  |  |
| Jan-20 | 4 |  |  |  |  |  |  |  |  |  |  |  |  |  |  |  |  |  |  |  |  |  |  |  |  |  |  |  |  |  |  |  |  |  |  |  |  |  |  |  |  |  |  |  |  |  |  |  |  |  |  |
| Feb-20 | 3.8 |  |  |  |  |  |  |  |  |  |  |  |  |  |  |  |  |  |  |  |  |  |  |  |  |  |  |  |  |  |  |  |  |  |  |  |  |  |  |  |  |  |  |  |  |  |  |  |  |  |  |
| Mar-20 | 4.5 |  |  |  |  |  |  |  |  |  |  |  |  |  |  |  |  |  |  |  |  |  |  |  |  |  |  |  |  |  |  |  |  |  |  |  |  |  |  |  |  |  |  |  |  |  |  |  |  |  |  |
| Apr-20 | 14.4 |  |  |  |  |  |  |  |  |  |  |  |  |  |  |  |  |  |  |  |  |  |  |  |  |  |  |  |  |  |  |  |  |  |  |  |  |  |  |  |  |  |  |  |  |  |  |  |  |  |  |
| May-20 | 13 |  |  |  |  |  |  |  |  |  |  |  |  |  |  |  |  |  |  |  |  |  |  |  |  |  |  |  |  |  |  |  |  |  |  |  |  |  |  |  |  |  |  |  |  |  |  |  |  |  |  |
| Jun-20 | 11.2 |  |  |  |  |  |  |  |  |  |  |  |  |  |  |  |  |  |  |  |  |  |  |  |  |  |  |  |  |  |  |  |  |  |  |  |  |  |  |  |  |  |  |  |  |  |  |  |  |  |  |
| Jul-20 | 10.5 |  |  |  |  |  |  |  |  |  |  |  |  |  |  |  |  |  |  |  |  |  |  |  |  |  |  |  |  |  |  |  |  |  |  |  |  |  |  |  |  |  |  |  |  |  |  |  |  |  |  |
| Aug-20 | 8.5 |  |  |  |  |  |  |  |  |  |  |  |  |  |  |  |  |  |  |  |  |  |  |  |  |  |  |  |  |  |  |  |  |  |  |  |  |  |  |  |  |  |  |  |  |  |  |  |  |  |  |
| Sep-20 | 7.7 |  |  |  |  |  |  |  |  |  |  |  |  |  |  |  |  |  |  |  |  |  |  |  |  |  |  |  |  |  |  |  |  |  |  |  |  |  |  |  |  |  |  |  |  |  |  |  |  |  |  |
| Oct-20 | 6.6 |  |  |  |  |  |  |  |  |  |  |  |  |  |  |  |  |  |  |  |  |  |  |  |  |  |  |  |  |  |  |  |  |  |  |  |  |  |  |  |  |  |  |  |  |  |  |  |  |  |  |
| Nov-20 | 6.4 |  |  |  |  |  |  |  |  |  |  |  |  |  |  |  |  |  |  |  |  |  |  |  |  |  |  |  |  |  |  |  |  |  |  |  |  |  |  |  |  |  |  |  |  |  |  |  |  |  |  |
| Dec-20 | 6.5 |  |  |  |  |  |  |  |  |  |  |  |  |  |  |  |  |  |  |  |  |  |  |  |  |  |  |  |  |  |  |  |  |  |  |  |  |  |  |  |  |  |  |  |  |  |  |  |  |  |  |
| Jan-21 | 6.8 |  |  |  |  |  |  |  |  |  |  |  |  |  |  |  |  |  |  |  |  |  |  |  |  |  |  |  |  |  |  |  |  |  |  |  |  |  |  |  |  |  |  |  |  |  |  |  |  |  |  |
| Feb-21 | 6.6 |  |  |  |  |  |  |  |  |  |  |  |  |  |  |  |  |  |  |  |  |  |  |  |  |  |  |  |  |  |  |  |  |  |  |  |  |  |  |  |  |  |  |  |  |  |  |  |  |  |  |
| Mar-21 | 6.2 |  |  |  |  |  |  |  |  |  |  |  |  |  |  |  |  |  |  |  |  |  |  |  |  |  |  |  |  |  |  |  |  |  |  |  |  |  |  |  |  |  |  |  |  |  |  |  |  |  |  |
| Apr-21 | 5.7 |  |  |  |  |  |  |  |  |  |  |  |  |  |  |  |  |  |  |  |  |  |  |  |  |  |  |  |  |  |  |  |  |  |  |  |  |  |  |  |  |  |  |  |  |  |  |  |  |  |  |
| May-21 | 5.5 |  |  |  |  |  |  |  |  |  |  |  |  |  |  |  |  |  |  |  |  |  |  |  |  |  |  |  |  |  |  |  |  |  |  |  |  |  |  |  |  |  |  |  |  |  |  |  |  |  |  |
| Jun-21 | 6.1 |  |  |  |  |  |  |  |  |  |  |  |  |  |  |  |  |  |  |  |  |  |  |  |  |  |  |  |  |  |  |  |  |  |  |  |  |  |  |  |  |  |  |  |  |  |  |  |  |  |  |
| Jul-21 | 5.7 |  |  |  |  |  |  |  |  |  |  |  |  |  |  |  |  |  |  |  |  |  |  |  |  |  |  |  |  |  |  |  |  |  |  |  |  |  |  |  |  |  |  |  |  |  |  |  |  |  |  |
| Aug-21 | 5.3 |  |  |  |  |  |  |  |  |  |  |  |  |  |  |  |  |  |  |  |  |  |  |  |  |  |  |  |  |  |  |  |  |  |  |  |  |  |  |  |  |  |  |  |  |  |  |  |  |  |  |
| Sep-21 | 4.6 |  |  |  |  |  |  |  |  |  |  |  |  |  |  |  |  |  |  |  |  |  |  |  |  |  |  |  |  |  |  |  |  |  |  |  |  |  |  |  |  |  |  |  |  |  |  |  |  |  |  |